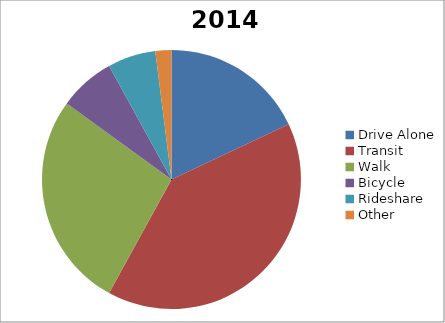
| Category | 2014 |
|---|---|
| Drive Alone | 18 |
| Transit | 40 |
| Walk | 27 |
| Bicycle | 7 |
| Rideshare | 6 |
| Other | 2 |